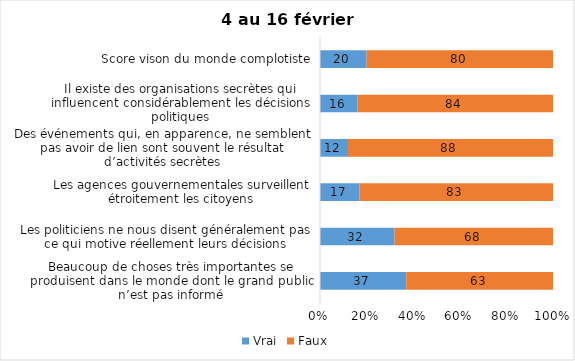
| Category | Vrai | Faux |
|---|---|---|
| Beaucoup de choses très importantes se produisent dans le monde dont le grand public n’est pas informé | 37 | 63 |
| Les politiciens ne nous disent généralement pas ce qui motive réellement leurs décisions | 32 | 68 |
| Les agences gouvernementales surveillent étroitement les citoyens | 17 | 83 |
| Des événements qui, en apparence, ne semblent pas avoir de lien sont souvent le résultat d’activités secrètes | 12 | 88 |
| Il existe des organisations secrètes qui influencent considérablement les décisions politiques | 16 | 84 |
| Score vison du monde complotiste | 20 | 80 |